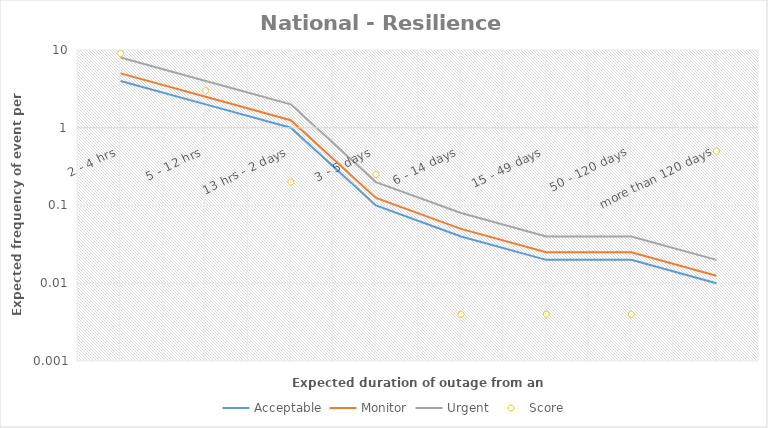
| Category | Acceptable | Monitor | Urgent | Score |
|---|---|---|---|---|
| 2 - 4 hrs | 4 | 5 | 8 | 9 |
| 5 - 12 hrs | 2 | 2.5 | 4 | 3 |
| 13 hrs - 2 days | 1 | 1.25 | 2 | 0.2 |
| 3 - 5 days | 0.1 | 0.125 | 0.2 | 0.25 |
| 6 - 14 days | 0.04 | 0.05 | 0.08 | 0.004 |
| 15 - 49 days | 0.02 | 0.025 | 0.04 | 0.004 |
| 50 - 120 days | 0.02 | 0.025 | 0.04 | 0.004 |
| more than 120 days | 0.01 | 0.012 | 0.02 | 0.5 |